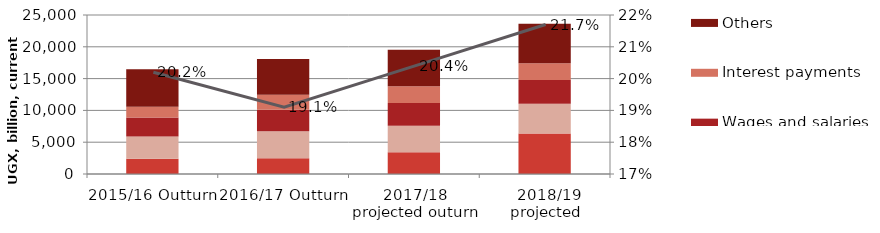
| Category | Development (externally financed) | Development (domestically financed) | Wages and salaries | Interest payments | Others |
|---|---|---|---|---|---|
| 2015/16 Outturn | 2384 | 3523 | 2966 | 1682 | 5901 |
| 2016/17 Outturn | 2477 | 4241 | 3382 | 2360 | 5635 |
| 2017/18 projected outurn | 3413 | 4177 | 3576 | 2648 | 5723 |
|  2018/19 projected | 6381 | 4670 | 3725 | 2634 | 6206 |